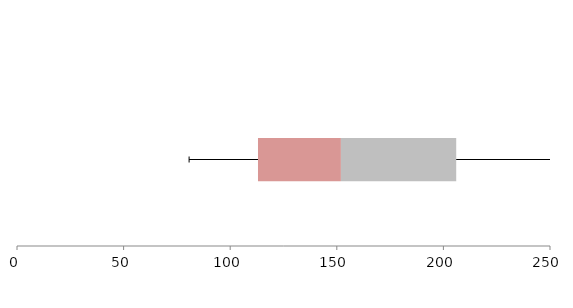
| Category | Series 1 | Series 2 | Series 3 |
|---|---|---|---|
| 0 | 113.037 | 38.891 | 54.083 |